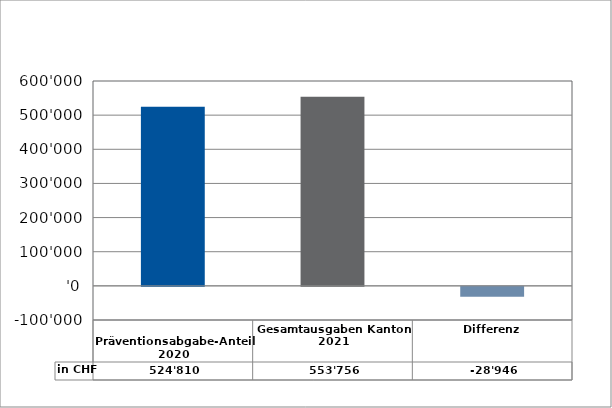
| Category | in CHF |
|---|---|
| 
Präventionsabgabe-Anteil 2020

 | 524810 |
| Gesamtausgaben Kanton 2021
 | 553756 |
| Differenz | -28946 |